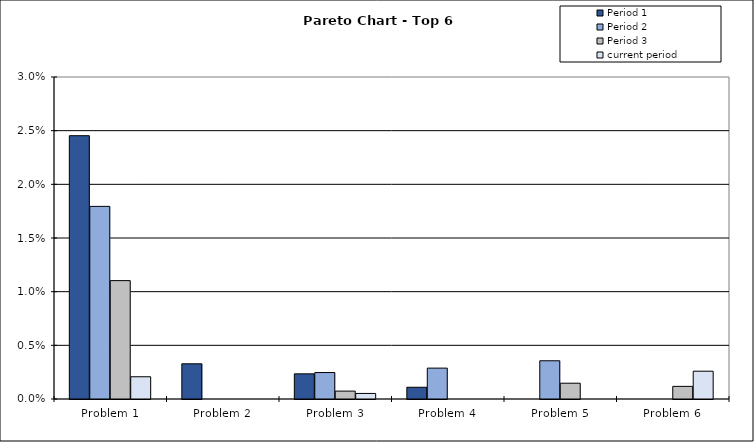
| Category | Period 1 | Period 2 | Period 3 | current period |
|---|---|---|---|---|
| Problem 1 | 0.025 | 0.018 | 0.011 | 0.002 |
| Problem 2 | 0.003 | 0 | 0 | 0 |
| Problem 3 | 0.002 | 0.002 | 0.001 | 0.001 |
| Problem 4 | 0.001 | 0.003 | 0 | 0 |
| Problem 5 | 0 | 0.004 | 0.001 | 0 |
| Problem 6 | 0 | 0 | 0.001 | 0.003 |